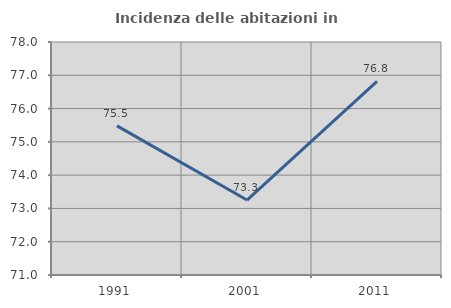
| Category | Incidenza delle abitazioni in proprietà  |
|---|---|
| 1991.0 | 75.482 |
| 2001.0 | 73.252 |
| 2011.0 | 76.818 |